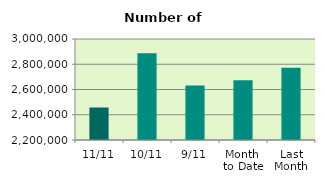
| Category | Series 0 |
|---|---|
| 11/11 | 2457284 |
| 10/11 | 2886982 |
| 9/11 | 2632578 |
| Month 
to Date | 2672766.222 |
| Last
Month | 2771381.143 |